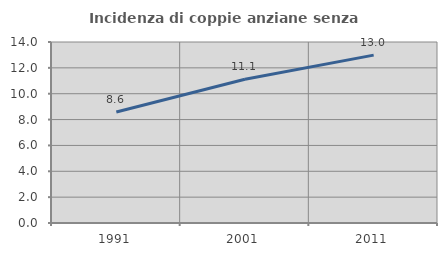
| Category | Incidenza di coppie anziane senza figli  |
|---|---|
| 1991.0 | 8.584 |
| 2001.0 | 11.123 |
| 2011.0 | 12.984 |